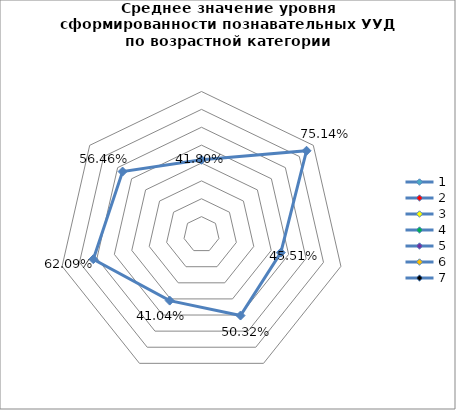
| Category | Series 0 |
|---|---|
| 0 | 0.418 |
| 1 | 0.751 |
| 2 | 0.455 |
| 3 | 0.503 |
| 4 | 0.41 |
| 5 | 0.621 |
| 6 | 0.565 |